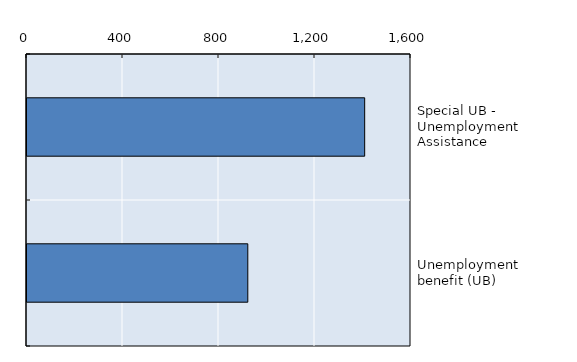
| Category | Series 0 |
|---|---|
| Special UB - Unemployment Assistance | 1407 |
| Unemployment benefit (UB) | 920 |